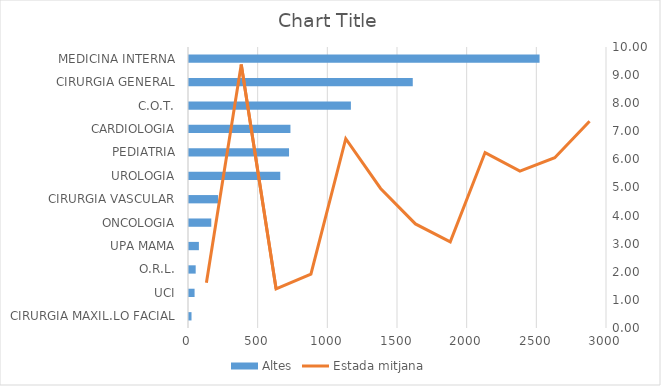
| Category | Altes |
|---|---|
| CIRURGIA MAXIL.LO FACIAL | 18 |
| UCI | 40 |
| O.R.L. | 48 |
| UPA MAMA | 71 |
| ONCOLOGIA | 160 |
| CIRURGIA VASCULAR | 208 |
| UROLOGIA | 655 |
| PEDIATRIA | 718 |
| CARDIOLOGIA | 728 |
| C.O.T. | 1162 |
| CIRURGIA GENERAL | 1606 |
| MEDICINA INTERNA | 2516 |